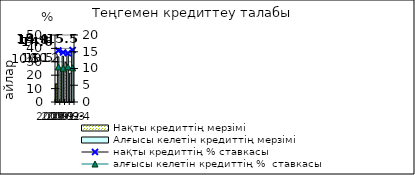
| Category | Нақты кредиттің мерзімі  | Алғысы келетін кредиттің мерзімі  |
|---|---|---|
| 2009-1 | 13.59 | 33.73 |
| 2009-2 | 22.78 | 34.2 |
| 2009-3 | 29.58 | 37.04 |
| 2009-4 | 21.55 | 39.22 |